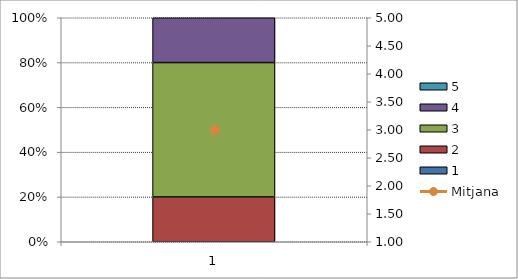
| Category | 1 | 2 | 3 | 4 | 5 |
|---|---|---|---|---|---|
| 0 | 0 | 1 | 3 | 1 | 0 |